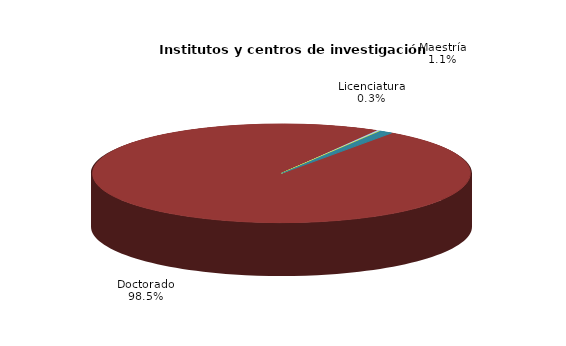
| Category | Series 0 |
|---|---|
| Licenciatura | 5 |
| Especialización | 0 |
| Maestría | 19 |
| Doctorado | 1630 |